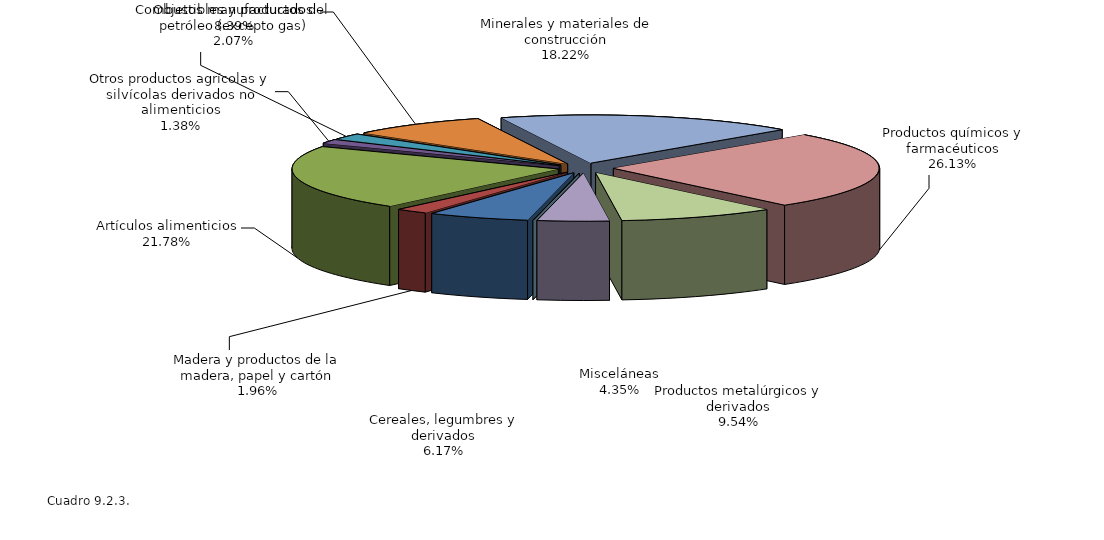
| Category | Series 0 |
|---|---|
| Cereales, legumbres y derivados | 6.175 |
| Madera y productos de la madera, papel y cartón | 1.965 |
| Artículos alimenticios | 21.776 |
| Otros productos agrícolas y silvícolas derivados no alimenticios | 1.378 |
| Combustibles y productos del petróleo (excepto gas) | 2.067 |
| Objetos manufacturados | 8.392 |
| Minerales y materiales de construcción | 18.223 |
| Productos químicos y farmacéuticos | 26.133 |
| Productos metalúrgicos y derivados | 9.539 |
| Misceláneas | 4.353 |